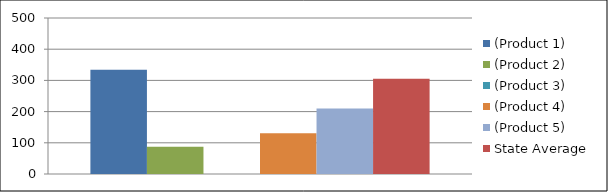
| Category | (Product 1) | (Product 2) | (Product 3) | (Product 4) | (Product 5) | State Average |
|---|---|---|---|---|---|---|
| 0 | 334 | 87 | 0 | 131 | 210 | 305 |